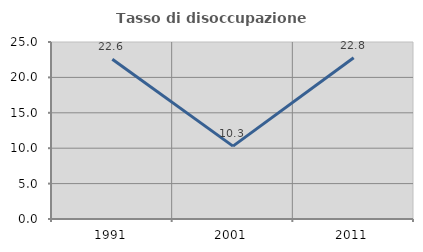
| Category | Tasso di disoccupazione giovanile  |
|---|---|
| 1991.0 | 22.571 |
| 2001.0 | 10.294 |
| 2011.0 | 22.785 |